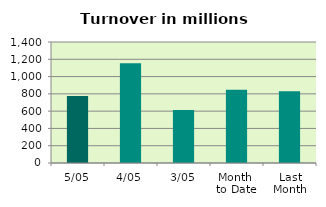
| Category | Series 0 |
|---|---|
| 5/05 | 776.011 |
| 4/05 | 1153.483 |
| 3/05 | 613.152 |
| Month 
to Date | 847.549 |
| Last
Month | 829.993 |